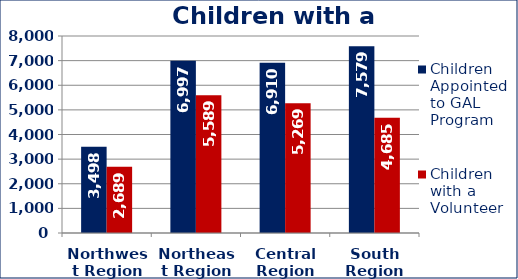
| Category | Children Appointed to GAL Program  | Children with a Volunteer  |
|---|---|---|
| Northwest Region | 3498 | 2689 |
| Northeast Region | 6997 | 5589 |
| Central Region | 6910 | 5269 |
| South Region | 7579 | 4685 |